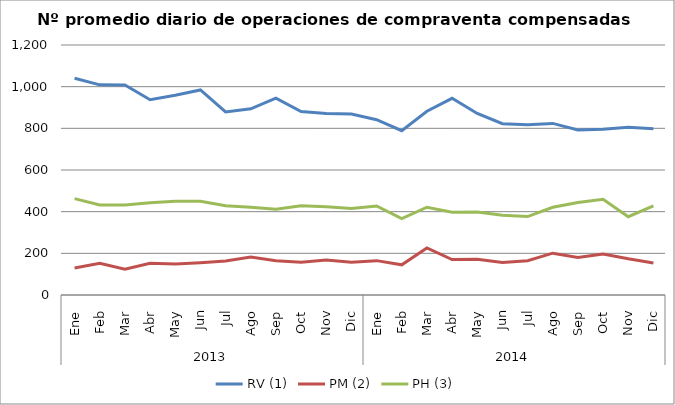
| Category | RV (1) | PM (2) | PH (3) |
|---|---|---|---|
| 0 | 1040.636 | 129.682 | 462.545 |
| 1 | 1008.7 | 152.35 | 432.05 |
| 2 | 1008.45 | 123.6 | 431.9 |
| 3 | 937.091 | 152.273 | 442.545 |
| 4 | 958.381 | 148.429 | 449.571 |
| 5 | 984.3 | 154.95 | 450 |
| 6 | 878.955 | 163.091 | 427.955 |
| 7 | 893.762 | 182.333 | 420.857 |
| 8 | 945.278 | 164.944 | 411.222 |
| 9 | 880.5 | 156.955 | 428.864 |
| 10 | 871.35 | 167.95 | 423.25 |
| 11 | 868.85 | 156.75 | 415.75 |
| 12 | 841.591 | 164.955 | 427.091 |
| 13 | 788.8 | 144.95 | 366.85 |
| 14 | 882.238 | 225.667 | 421.238 |
| 15 | 944 | 170.238 | 397.381 |
| 16 | 871.55 | 171.45 | 398.25 |
| 17 | 822.476 | 155.857 | 382.905 |
| 18 | 816.818 | 164.682 | 376.318 |
| 19 | 823.65 | 200.7 | 421.15 |
| 20 | 791.85 | 180.5 | 444.45 |
| 21 | 795.045 | 197.045 | 459.864 |
| 22 | 805.3 | 173.9 | 375.7 |
| 23 | 797.55 | 153.55 | 427.25 |